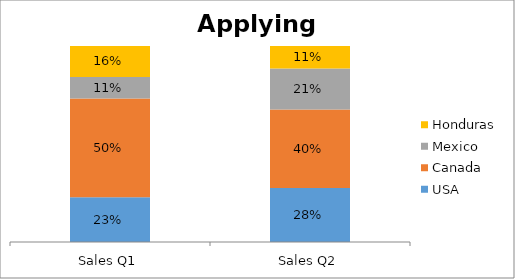
| Category | USA | Canada | Mexico | Honduras |
|---|---|---|---|---|
| Sales Q1 | 0.229 | 0.503 | 0.11 | 0.158 |
| Sales Q2 | 0.275 | 0.401 | 0.209 | 0.115 |